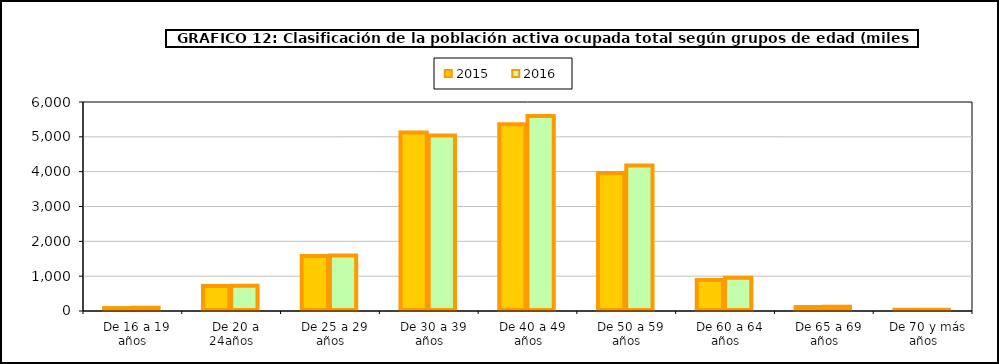
| Category | 2015 | 2016 |
|---|---|---|
|   De 16 a 19 años | 83.825 | 95.8 |
|   De 20 a 24años | 718.85 | 724.6 |
|   De 25 a 29 años | 1577.65 | 1592.6 |
|   De 30 a 39 años | 5124.45 | 5036.9 |
|   De 40 a 49 años | 5362.08 | 5600.9 |
|   De 50 a 59 años | 3961.2 | 4179.1 |
|   De 60 a 64 años | 889.4 | 952.9 |
|   De 65 a 69 años | 115.55 | 123.9 |
|   De 70 y más años | 33 | 35.1 |